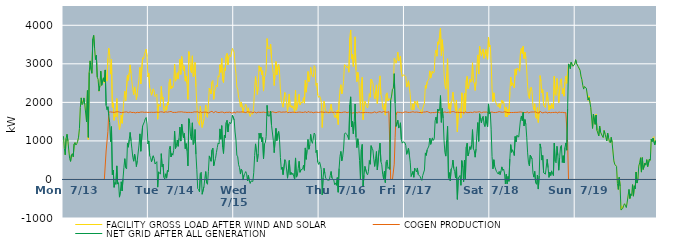
| Category | FACILITY GROSS LOAD AFTER WIND AND SOLAR | COGEN PRODUCTION | NET GRID AFTER ALL GENERATION |
|---|---|---|---|
|  Mon  7/13 | 1122 | 0 | 1122 |
|  Mon  7/13 | 817 | 0 | 808 |
|  Mon  7/13 | 640 | 0 | 640 |
|  Mon  7/13 | 1066 | 0 | 1066 |
|  Mon  7/13 | 1167 | 0 | 1172 |
|  Mon  7/13 | 1003 | 0 | 1003 |
|  Mon  7/13 | 740 | 0 | 763 |
|  Mon  7/13 | 600 | 0 | 540 |
|  Mon  7/13 | 475 | 0 | 469 |
|  Mon  7/13 | 636 | 0 | 636 |
|  Mon  7/13 | 669 | 0 | 669 |
|  Mon  7/13 | 581 | 0 | 588 |
|  Mon  7/13 | 918 | 0 | 918 |
|  Mon  7/13 | 959 | 0 | 959 |
|  Mon  7/13 | 893 | 0 | 893 |
|  Mon  7/13 | 928 | 0 | 928 |
|  Mon  7/13 | 991 | 0 | 991 |
|  Mon  7/13 | 1097 | 0 | 1097 |
|  Mon  7/13 | 1302 | 0 | 1326 |
|  Mon  7/13 | 1867 | 0 | 1867 |
|  Mon  7/13 | 2116 | 0 | 2116 |
|  Mon  7/13 | 1944 | 0 | 1944 |
|  Mon  7/13 | 1960 | 0 | 1970 |
|  Mon  7/13 | 2115 | 0 | 2115 |
|  Mon  7/13 | 1944 | 0 | 1944 |
|  Mon  7/13 | 1920 | 0 | 1920 |
|  Mon  7/13 | 1493 | 0 | 1493 |
|  Mon  7/13 | 2306 | 0 | 2306 |
|  Mon  7/13 | 1040 | 0 | 1092 |
|  Mon  7/13 | 2775 | 0 | 2776 |
|  Mon  7/13 | 3076 | 0 | 3076 |
|  Mon  7/13 | 2848 | 0 | 2848 |
|  Mon  7/13 | 2754 | 0 | 2754 |
|  Mon  7/13 | 3640 | 0 | 3650 |
|  Mon  7/13 | 3739 | 0 | 3739 |
|  Mon  7/13 | 3408 | 0 | 3408 |
|  Mon  7/13 | 3111 | 0 | 3111 |
|  Mon  7/13 | 3222 | 0 | 3221 |
|  Mon  7/13 | 2654 | 0 | 2654 |
|  Mon  7/13 | 2595 | 0 | 2595 |
|  Mon  7/13 | 2288 | 0 | 2292 |
|  Mon  7/13 | 2429 | 0 | 2434 |
|  Mon  7/13 | 2809 | 0 | 2809 |
|  Mon  7/13 | 2442 | 0 | 2442 |
|  Mon  7/13 | 2431 | 0 | 2431 |
|  Mon  7/13 | 2636 | 0 | 2636 |
|  Mon  7/13 | 2501 | 0 | 2535 |
|  Mon  7/13 | 2841 | 0 | 2841 |
|  Mon  7/13 | 2657 | 738 | 1919 |
|  Mon  7/13 | 2550 | 739 | 1811 |
|  Mon  7/13 | 3140 | 1246 | 1886 |
|  Mon  7/13 | 3405 | 1747 | 1658 |
|  Mon  7/13 | 3223 | 1749 | 1474 |
|  Mon  7/13 | 2733 | 1752 | 981 |
|  Mon  7/13 | 3113 | 1743 | 1370 |
|  Mon  7/13 | 1871 | 1745 | 126 |
|  Mon  7/13 | 1987 | 1743 | 244 |
|  Mon  7/13 | 1535 | 1739 | -204 |
|  Mon  7/13 | 1700 | 1753 | -79 |
|  Mon  7/13 | 1625 | 1751 | -126 |
|  Mon  7/13 | 2098 | 1746 | 352 |
|  Mon  7/13 | 1643 | 1758 | -120 |
|  Mon  7/13 | 1661 | 1743 | -82 |
|  Mon  7/13 | 1291 | 1746 | -459 |
|  Mon  7/13 | 1450 | 1743 | -322 |
|  Mon  7/13 | 1673 | 1733 | -60 |
|  Mon  7/13 | 1456 | 1748 | -299 |
|  Mon  7/13 | 1764 | 1741 | 23 |
|  Mon  7/13 | 2071 | 1750 | 314 |
|  Mon  7/13 | 2287 | 1748 | 539 |
|  Mon  7/13 | 2043 | 1738 | 305 |
|  Mon  7/13 | 2033 | 1753 | 273 |
|  Mon  7/13 | 2709 | 1757 | 939 |
|  Mon  7/13 | 2570 | 1733 | 837 |
|  Mon  7/13 | 2767 | 1731 | 1036 |
|  Mon  7/13 | 2973 | 1753 | 1220 |
|  Mon  7/13 | 2750 | 1748 | 1002 |
|  Mon  7/13 | 2530 | 1736 | 794 |
|  Mon  7/13 | 2340 | 1752 | 577 |
|  Mon  7/13 | 2201 | 1740 | 473 |
|  Mon  7/13 | 2402 | 1738 | 659 |
|  Mon  7/13 | 2270 | 1727 | 530 |
|  Mon  7/13 | 2074 | 1740 | 334 |
|  Mon  7/13 | 2233 | 1742 | 491 |
|  Mon  7/13 | 2228 | 1753 | 486 |
|  Mon  7/13 | 2628 | 1736 | 892 |
|  Mon  7/13 | 2906 | 1757 | 1183 |
|  Mon  7/13 | 2480 | 1748 | 732 |
|  Mon  7/13 | 2458 | 1745 | 713 |
|  Mon  7/13 | 3156 | 1749 | 1385 |
|  Mon  7/13 | 3124 | 1736 | 1388 |
|  Mon  7/13 | 3235 | 1741 | 1494 |
|  Mon  7/13 | 3312 | 1740 | 1572 |
|  Mon  7/13 | 3379 | 1745 | 1607 |
|  Mon  7/13 | 3187 | 1749 | 1438 |
|  Mon  7/13 | 2662 | 1739 | 923 |
|  Tue  7/14 | 2753 | 1753 | 1000 |
|  Tue  7/14 | 2385 | 1741 | 615 |
|  Tue  7/14 | 2312 | 1742 | 570 |
|  Tue  7/14 | 2186 | 1743 | 458 |
|  Tue  7/14 | 2177 | 1745 | 441 |
|  Tue  7/14 | 2351 | 1740 | 614 |
|  Tue  7/14 | 2295 | 1761 | 545 |
|  Tue  7/14 | 2147 | 1742 | 400 |
|  Tue  7/14 | 2150 | 1761 | 389 |
|  Tue  7/14 | 2217 | 1747 | 461 |
|  Tue  7/14 | 1562 | 1738 | -199 |
|  Tue  7/14 | 1951 | 1740 | 198 |
|  Tue  7/14 | 1932 | 1765 | 182 |
|  Tue  7/14 | 1891 | 1753 | 138 |
|  Tue  7/14 | 2415 | 1746 | 669 |
|  Tue  7/14 | 2084 | 1753 | 331 |
|  Tue  7/14 | 2134 | 1738 | 396 |
|  Tue  7/14 | 1792 | 1738 | 54 |
|  Tue  7/14 | 1747 | 1738 | 9 |
|  Tue  7/14 | 1901 | 1754 | 147 |
|  Tue  7/14 | 1797 | 1763 | 34 |
|  Tue  7/14 | 1999 | 1745 | 238 |
|  Tue  7/14 | 1933 | 1732 | 201 |
|  Tue  7/14 | 2533 | 1756 | 777 |
|  Tue  7/14 | 2608 | 1747 | 861 |
|  Tue  7/14 | 2349 | 1764 | 585 |
|  Tue  7/14 | 2423 | 1748 | 674 |
|  Tue  7/14 | 2379 | 1739 | 629 |
|  Tue  7/14 | 2499 | 1740 | 759 |
|  Tue  7/14 | 2994 | 1740 | 1254 |
|  Tue  7/14 | 2550 | 1748 | 802 |
|  Tue  7/14 | 2627 | 1740 | 879 |
|  Tue  7/14 | 2769 | 1747 | 1022 |
|  Tue  7/14 | 2605 | 1751 | 860 |
|  Tue  7/14 | 2821 | 1754 | 1067 |
|  Tue  7/14 | 3120 | 1752 | 1358 |
|  Tue  7/14 | 2725 | 1731 | 994 |
|  Tue  7/14 | 3190 | 1755 | 1435 |
|  Tue  7/14 | 3210 | 1754 | 1456 |
|  Tue  7/14 | 2824 | 1745 | 1079 |
|  Tue  7/14 | 2946 | 1752 | 1194 |
|  Tue  7/14 | 2550 | 1744 | 800 |
|  Tue  7/14 | 2683 | 1753 | 930 |
|  Tue  7/14 | 2488 | 1738 | 746 |
|  Tue  7/14 | 2077 | 1726 | 351 |
|  Tue  7/14 | 3317 | 1741 | 1576 |
|  Tue  7/14 | 3197 | 1740 | 1457 |
|  Tue  7/14 | 2827 | 1738 | 1111 |
|  Tue  7/14 | 2767 | 1745 | 1022 |
|  Tue  7/14 | 3207 | 1738 | 1469 |
|  Tue  7/14 | 2660 | 1752 | 908 |
|  Tue  7/14 | 2702 | 1753 | 963 |
|  Tue  7/14 | 3037 | 1741 | 1296 |
|  Tue  7/14 | 2405 | 1751 | 654 |
|  Tue  7/14 | 1968 | 1741 | 251 |
|  Tue  7/14 | 1529 | 1754 | -239 |
|  Tue  7/14 | 1520 | 1743 | -265 |
|  Tue  7/14 | 1405 | 1731 | -322 |
|  Tue  7/14 | 1904 | 1762 | 157 |
|  Tue  7/14 | 1923 | 1736 | 187 |
|  Tue  7/14 | 1351 | 1735 | -384 |
|  Tue  7/14 | 1327 | 1744 | -377 |
|  Tue  7/14 | 1563 | 1749 | -186 |
|  Tue  7/14 | 1767 | 1746 | 21 |
|  Tue  7/14 | 1933 | 1734 | 204 |
|  Tue  7/14 | 1656 | 1744 | -88 |
|  Tue  7/14 | 1610 | 1736 | -126 |
|  Tue  7/14 | 1933 | 1726 | 207 |
|  Tue  7/14 | 2368 | 1741 | 611 |
|  Tue  7/14 | 2379 | 1749 | 630 |
|  Tue  7/14 | 2219 | 1747 | 472 |
|  Tue  7/14 | 2530 | 1768 | 762 |
|  Tue  7/14 | 2567 | 1754 | 813 |
|  Tue  7/14 | 2078 | 1731 | 356 |
|  Tue  7/14 | 2286 | 1750 | 459 |
|  Tue  7/14 | 2310 | 1763 | 547 |
|  Tue  7/14 | 2449 | 1755 | 694 |
|  Tue  7/14 | 2403 | 1741 | 826 |
|  Tue  7/14 | 2692 | 1746 | 946 |
|  Tue  7/14 | 2655 | 1735 | 920 |
|  Tue  7/14 | 2977 | 1738 | 1312 |
|  Tue  7/14 | 2776 | 1747 | 1044 |
|  Tue  7/14 | 3141 | 1745 | 1396 |
|  Tue  7/14 | 2582 | 1749 | 833 |
|  Tue  7/14 | 2512 | 1733 | 673 |
|  Tue  7/14 | 2894 | 1729 | 1152 |
|  Tue  7/14 | 2829 | 1744 | 1085 |
|  Tue  7/14 | 3211 | 1743 | 1476 |
|  Tue  7/14 | 3270 | 1735 | 1535 |
|  Tue  7/14 | 2972 | 1741 | 1231 |
|  Tue  7/14 | 3188 | 1751 | 1437 |
|  Tue  7/14 | 3231 | 1746 | 1485 |
|  Tue  7/14 | 3182 | 1739 | 1443 |
|  Tue  7/14 | 3202 | 1726 | 1495 |
|  Tue  7/14 | 3400 | 1731 | 1669 |
|  Tue  7/14 | 3379 | 1726 | 1653 |
|  Wed  7/15 | 3300 | 1756 | 1544 |
|  Wed  7/15 | 2962 | 1722 | 1230 |
|  Wed  7/15 | 2750 | 1741 | 1023 |
|  Wed  7/15 | 2399 | 1753 | 632 |
|  Wed  7/15 | 2336 | 1757 | 589 |
|  Wed  7/15 | 2127 | 1747 | 380 |
|  Wed  7/15 | 2067 | 1748 | 312 |
|  Wed  7/15 | 1885 | 1748 | 140 |
|  Wed  7/15 | 2009 | 1743 | 266 |
|  Wed  7/15 | 1984 | 1753 | 231 |
|  Wed  7/15 | 1732 | 1747 | -15 |
|  Wed  7/15 | 1858 | 1747 | 111 |
|  Wed  7/15 | 1901 | 1745 | 157 |
|  Wed  7/15 | 1954 | 1735 | 204 |
|  Wed  7/15 | 1880 | 1732 | 148 |
|  Wed  7/15 | 1720 | 1758 | -38 |
|  Wed  7/15 | 1857 | 1753 | 104 |
|  Wed  7/15 | 1707 | 1744 | -37 |
|  Wed  7/15 | 1634 | 1738 | -104 |
|  Wed  7/15 | 1713 | 1752 | -39 |
|  Wed  7/15 | 1721 | 1736 | -26 |
|  Wed  7/15 | 1695 | 1731 | -51 |
|  Wed  7/15 | 1918 | 1744 | 174 |
|  Wed  7/15 | 2370 | 1751 | 619 |
|  Wed  7/15 | 2669 | 1748 | 923 |
|  Wed  7/15 | 2439 | 1726 | 713 |
|  Wed  7/15 | 2206 | 1730 | 461 |
|  Wed  7/15 | 2407 | 1747 | 666 |
|  Wed  7/15 | 2949 | 1749 | 1200 |
|  Wed  7/15 | 2809 | 1740 | 1069 |
|  Wed  7/15 | 2915 | 1744 | 1202 |
|  Wed  7/15 | 2716 | 1741 | 975 |
|  Wed  7/15 | 2819 | 1733 | 1086 |
|  Wed  7/15 | 2293 | 1747 | 536 |
|  Wed  7/15 | 2661 | 1738 | 923 |
|  Wed  7/15 | 2690 | 1738 | 952 |
|  Wed  7/15 | 2859 | 1747 | 1113 |
|  Wed  7/15 | 3655 | 1733 | 1922 |
|  Wed  7/15 | 3392 | 1745 | 1647 |
|  Wed  7/15 | 3381 | 1757 | 1624 |
|  Wed  7/15 | 3400 | 1752 | 1648 |
|  Wed  7/15 | 3513 | 1733 | 1771 |
|  Wed  7/15 | 3143 | 1739 | 1404 |
|  Wed  7/15 | 3163 | 1757 | 1406 |
|  Wed  7/15 | 2750 | 1741 | 1019 |
|  Wed  7/15 | 2438 | 1743 | 695 |
|  Wed  7/15 | 2451 | 1749 | 699 |
|  Wed  7/15 | 3057 | 1732 | 1325 |
|  Wed  7/15 | 2712 | 1733 | 1007 |
|  Wed  7/15 | 2922 | 1749 | 1186 |
|  Wed  7/15 | 2982 | 1736 | 1246 |
|  Wed  7/15 | 2784 | 1756 | 1034 |
|  Wed  7/15 | 2323 | 1751 | 572 |
|  Wed  7/15 | 2053 | 1742 | 263 |
|  Wed  7/15 | 2055 | 1736 | 319 |
|  Wed  7/15 | 1875 | 1750 | 125 |
|  Wed  7/15 | 1895 | 1744 | 133 |
|  Wed  7/15 | 2257 | 1747 | 513 |
|  Wed  7/15 | 2205 | 1743 | 462 |
|  Wed  7/15 | 2229 | 1757 | 472 |
|  Wed  7/15 | 1763 | 1731 | 32 |
|  Wed  7/15 | 1766 | 1737 | 21 |
|  Wed  7/15 | 2217 | 1741 | 493 |
|  Wed  7/15 | 1879 | 1752 | 127 |
|  Wed  7/15 | 1924 | 1738 | 186 |
|  Wed  7/15 | 1851 | 1730 | 121 |
|  Wed  7/15 | 1910 | 1746 | 164 |
|  Wed  7/15 | 1825 | 1751 | 74 |
|  Wed  7/15 | 1735 | 1741 | 6 |
|  Wed  7/15 | 2311 | 1753 | 558 |
|  Wed  7/15 | 1797 | 1738 | 59 |
|  Wed  7/15 | 1815 | 1743 | 93 |
|  Wed  7/15 | 2031 | 1745 | 286 |
|  Wed  7/15 | 2207 | 1737 | 470 |
|  Wed  7/15 | 1935 | 1749 | 186 |
|  Wed  7/15 | 1993 | 1745 | 248 |
|  Wed  7/15 | 1981 | 1740 | 241 |
|  Wed  7/15 | 1998 | 1727 | 271 |
|  Wed  7/15 | 2122 | 1740 | 372 |
|  Wed  7/15 | 1980 | 1743 | 237 |
|  Wed  7/15 | 2573 | 1755 | 818 |
|  Wed  7/15 | 2264 | 1743 | 521 |
|  Wed  7/15 | 2504 | 1731 | 773 |
|  Wed  7/15 | 2801 | 1763 | 1038 |
|  Wed  7/15 | 2536 | 1752 | 784 |
|  Wed  7/15 | 2632 | 1743 | 889 |
|  Wed  7/15 | 2905 | 1735 | 1170 |
|  Wed  7/15 | 2737 | 1747 | 990 |
|  Wed  7/15 | 2683 | 1754 | 937 |
|  Wed  7/15 | 2655 | 1730 | 925 |
|  Wed  7/15 | 2952 | 1748 | 1204 |
|  Wed  7/15 | 2905 | 1744 | 1161 |
|  Wed  7/15 | 2441 | 1749 | 700 |
|  Wed  7/15 | 2502 | 1745 | 757 |
|  Wed  7/15 | 2191 | 1735 | 450 |
|  Wed  7/15 | 2128 | 1738 | 390 |
|  Thu  7/16 | 2167 | 1736 | 455 |
|  Thu  7/16 | 2120 | 1749 | 373 |
|  Thu  7/16 | 1998 | 1744 | 254 |
|  Thu  7/16 | 1349 | 1750 | -401 |
|  Thu  7/16 | 1765 | 1746 | 44 |
|  Thu  7/16 | 2031 | 1740 | 291 |
|  Thu  7/16 | 1888 | 1734 | 154 |
|  Thu  7/16 | 1772 | 1746 | 26 |
|  Thu  7/16 | 1781 | 1738 | 43 |
|  Thu  7/16 | 1728 | 1743 | -15 |
|  Thu  7/16 | 1722 | 1748 | -26 |
|  Thu  7/16 | 1723 | 1737 | -18 |
|  Thu  7/16 | 1824 | 1727 | 100 |
|  Thu  7/16 | 1952 | 1746 | 206 |
|  Thu  7/16 | 1785 | 1744 | 34 |
|  Thu  7/16 | 1798 | 1737 | 59 |
|  Thu  7/16 | 1726 | 1739 | -13 |
|  Thu  7/16 | 1611 | 1746 | -135 |
|  Thu  7/16 | 1661 | 1751 | -90 |
|  Thu  7/16 | 1588 | 1736 | -152 |
|  Thu  7/16 | 1799 | 1740 | 49 |
|  Thu  7/16 | 1425 | 1744 | -332 |
|  Thu  7/16 | 2026 | 1737 | 284 |
|  Thu  7/16 | 2329 | 1736 | 599 |
|  Thu  7/16 | 2458 | 1731 | 727 |
|  Thu  7/16 | 2218 | 1735 | 483 |
|  Thu  7/16 | 2323 | 1726 | 597 |
|  Thu  7/16 | 2535 | 1747 | 788 |
|  Thu  7/16 | 2977 | 1756 | 1176 |
|  Thu  7/16 | 2959 | 1751 | 1208 |
|  Thu  7/16 | 2945 | 1739 | 1206 |
|  Thu  7/16 | 2894 | 1732 | 1162 |
|  Thu  7/16 | 2931 | 1749 | 1182 |
|  Thu  7/16 | 2782 | 1747 | 1036 |
|  Thu  7/16 | 3678 | 1742 | 1936 |
|  Thu  7/16 | 3878 | 1734 | 2144 |
|  Thu  7/16 | 3124 | 1759 | 1365 |
|  Thu  7/16 | 3251 | 1724 | 1504 |
|  Thu  7/16 | 2932 | 1746 | 1186 |
|  Thu  7/16 | 3229 | 1734 | 1495 |
|  Thu  7/16 | 3701 | 1745 | 1956 |
|  Thu  7/16 | 2839 | 1738 | 1101 |
|  Thu  7/16 | 2536 | 1732 | 825 |
|  Thu  7/16 | 2782 | 1726 | 1056 |
|  Thu  7/16 | 2641 | 1753 | 888 |
|  Thu  7/16 | 2240 | 1748 | 492 |
|  Thu  7/16 | 1798 | 1734 | 1 |
|  Thu  7/16 | 2497 | 1746 | 778 |
|  Thu  7/16 | 2650 | 1733 | 910 |
|  Thu  7/16 | 1552 | 1733 | -181 |
|  Thu  7/16 | 1842 | 1734 | 108 |
|  Thu  7/16 | 2027 | 1727 | 340 |
|  Thu  7/16 | 1969 | 1741 | 316 |
|  Thu  7/16 | 1899 | 1730 | 159 |
|  Thu  7/16 | 1853 | 1736 | 120 |
|  Thu  7/16 | 1969 | 1729 | 205 |
|  Thu  7/16 | 2224 | 1734 | 490 |
|  Thu  7/16 | 2134 | 1739 | 395 |
|  Thu  7/16 | 2603 | 1727 | 876 |
|  Thu  7/16 | 2552 | 1742 | 810 |
|  Thu  7/16 | 2499 | 1735 | 764 |
|  Thu  7/16 | 2273 | 1748 | 525 |
|  Thu  7/16 | 2088 | 1754 | 338 |
|  Thu  7/16 | 2265 | 1757 | 539 |
|  Thu  7/16 | 2453 | 1729 | 724 |
|  Thu  7/16 | 1969 | 1750 | 246 |
|  Thu  7/16 | 1980 | 1748 | 225 |
|  Thu  7/16 | 2497 | 1741 | 759 |
|  Thu  7/16 | 2688 | 1759 | 942 |
|  Thu  7/16 | 2200 | 1738 | 462 |
|  Thu  7/16 | 2118 | 1738 | 380 |
|  Thu  7/16 | 1868 | 1732 | 136 |
|  Thu  7/16 | 1810 | 1764 | 14 |
|  Thu  7/16 | 1962 | 1747 | 215 |
|  Thu  7/16 | 1669 | 1746 | -81 |
|  Thu  7/16 | 2208 | 1755 | 459 |
|  Thu  7/16 | 2248 | 1742 | 506 |
|  Thu  7/16 | 2038 | 1758 | 285 |
|  Thu  7/16 | 2094 | 1759 | 314 |
|  Thu  7/16 | 2093 | 1736 | 260 |
|  Thu  7/16 | 2053 | 0 | 2053 |
|  Thu  7/16 | 2129 | 0 | 2163 |
|  Thu  7/16 | 2339 | 0 | 2339 |
|  Thu  7/16 | 2368 | 0 | 2368 |
|  Thu  7/16 | 3141 | 397 | 2744 |
|  Thu  7/16 | 3069 | 1087 | 1982 |
|  Thu  7/16 | 3013 | 1655 | 1375 |
|  Thu  7/16 | 3102 | 1745 | 1366 |
|  Thu  7/16 | 3302 | 1743 | 1534 |
|  Thu  7/16 | 3075 | 1742 | 1333 |
|  Thu  7/16 | 3110 | 1747 | 1363 |
|  Thu  7/16 | 3203 | 1739 | 1470 |
|  Thu  7/16 | 2787 | 1750 | 1037 |
|  Thu  7/16 | 2668 | 1726 | 942 |
|  Thu  7/16 | 2713 | 1737 | 975 |
|  Thu  7/16 | 2709 | 1747 | 962 |
|  Fri  7/17 | 2696 | 1741 | 955 |
|  Fri  7/17 | 2668 | 1753 | 881 |
|  Fri  7/17 | 2396 | 1748 | 653 |
|  Fri  7/17 | 2478 | 1741 | 737 |
|  Fri  7/17 | 2561 | 1746 | 815 |
|  Fri  7/17 | 2389 | 1739 | 638 |
|  Fri  7/17 | 2203 | 1754 | 449 |
|  Fri  7/17 | 1826 | 1745 | 77 |
|  Fri  7/17 | 1798 | 1731 | 74 |
|  Fri  7/17 | 1965 | 1757 | 206 |
|  Fri  7/17 | 1809 | 1752 | 57 |
|  Fri  7/17 | 2036 | 1743 | 293 |
|  Fri  7/17 | 2047 | 1739 | 256 |
|  Fri  7/17 | 1942 | 1749 | 193 |
|  Fri  7/17 | 2039 | 1740 | 298 |
|  Fri  7/17 | 1868 | 1742 | 128 |
|  Fri  7/17 | 1869 | 1718 | 139 |
|  Fri  7/17 | 1815 | 1735 | 80 |
|  Fri  7/17 | 1750 | 1733 | 17 |
|  Fri  7/17 | 1706 | 1739 | -24 |
|  Fri  7/17 | 1842 | 1742 | 100 |
|  Fri  7/17 | 1822 | 1747 | 75 |
|  Fri  7/17 | 1981 | 1735 | 246 |
|  Fri  7/17 | 2440 | 1751 | 689 |
|  Fri  7/17 | 2366 | 1742 | 624 |
|  Fri  7/17 | 2530 | 1762 | 768 |
|  Fri  7/17 | 2555 | 1752 | 793 |
|  Fri  7/17 | 2609 | 1741 | 868 |
|  Fri  7/17 | 2817 | 1745 | 1072 |
|  Fri  7/17 | 2629 | 1728 | 911 |
|  Fri  7/17 | 2634 | 1744 | 890 |
|  Fri  7/17 | 2814 | 1736 | 1078 |
|  Fri  7/17 | 2758 | 1744 | 1014 |
|  Fri  7/17 | 2791 | 1734 | 1057 |
|  Fri  7/17 | 3263 | 1742 | 1521 |
|  Fri  7/17 | 3355 | 1745 | 1617 |
|  Fri  7/17 | 3198 | 1741 | 1457 |
|  Fri  7/17 | 3569 | 1744 | 1825 |
|  Fri  7/17 | 3505 | 1733 | 1772 |
|  Fri  7/17 | 3527 | 1729 | 1798 |
|  Fri  7/17 | 3924 | 1749 | 2175 |
|  Fri  7/17 | 3210 | 1728 | 1482 |
|  Fri  7/17 | 3626 | 1740 | 1842 |
|  Fri  7/17 | 3333 | 1740 | 1593 |
|  Fri  7/17 | 2762 | 1747 | 1015 |
|  Fri  7/17 | 2449 | 1751 | 698 |
|  Fri  7/17 | 2343 | 1738 | 605 |
|  Fri  7/17 | 2748 | 1736 | 1012 |
|  Fri  7/17 | 3132 | 1753 | 1379 |
|  Fri  7/17 | 1835 | 1744 | 31 |
|  Fri  7/17 | 1972 | 1736 | 176 |
|  Fri  7/17 | 1712 | 1744 | -32 |
|  Fri  7/17 | 2006 | 1735 | 271 |
|  Fri  7/17 | 2061 | 1757 | 317 |
|  Fri  7/17 | 2264 | 1743 | 502 |
|  Fri  7/17 | 2018 | 1758 | 279 |
|  Fri  7/17 | 1940 | 1738 | 202 |
|  Fri  7/17 | 1781 | 1741 | 40 |
|  Fri  7/17 | 2058 | 1732 | 326 |
|  Fri  7/17 | 1231 | 1743 | -516 |
|  Fri  7/17 | 1769 | 1750 | 33 |
|  Fri  7/17 | 1757 | 1737 | 20 |
|  Fri  7/17 | 1848 | 1749 | 103 |
|  Fri  7/17 | 1591 | 1743 | -152 |
|  Fri  7/17 | 2247 | 1758 | 489 |
|  Fri  7/17 | 2070 | 1738 | 325 |
|  Fri  7/17 | 1689 | 1749 | -60 |
|  Fri  7/17 | 2228 | 1726 | 502 |
|  Fri  7/17 | 1757 | 1755 | 12 |
|  Fri  7/17 | 2572 | 1744 | 841 |
|  Fri  7/17 | 2676 | 1734 | 942 |
|  Fri  7/17 | 2354 | 1742 | 612 |
|  Fri  7/17 | 2433 | 1737 | 696 |
|  Fri  7/17 | 2602 | 1752 | 850 |
|  Fri  7/17 | 2523 | 1743 | 780 |
|  Fri  7/17 | 2622 | 1759 | 903 |
|  Fri  7/17 | 3027 | 1735 | 1292 |
|  Fri  7/17 | 2535 | 1740 | 795 |
|  Fri  7/17 | 2501 | 1754 | 747 |
|  Fri  7/17 | 2309 | 1731 | 578 |
|  Fri  7/17 | 2538 | 1744 | 794 |
|  Fri  7/17 | 2969 | 1747 | 1202 |
|  Fri  7/17 | 3230 | 1749 | 1476 |
|  Fri  7/17 | 2738 | 1751 | 987 |
|  Fri  7/17 | 3462 | 1758 | 1704 |
|  Fri  7/17 | 3286 | 1733 | 1553 |
|  Fri  7/17 | 3200 | 1732 | 1468 |
|  Fri  7/17 | 3324 | 1729 | 1595 |
|  Fri  7/17 | 3387 | 1747 | 1640 |
|  Fri  7/17 | 3143 | 1732 | 1435 |
|  Fri  7/17 | 3120 | 1747 | 1373 |
|  Fri  7/17 | 3370 | 1736 | 1634 |
|  Fri  7/17 | 3199 | 1748 | 1451 |
|  Fri  7/17 | 3117 | 1742 | 1368 |
|  Fri  7/17 | 3693 | 1720 | 1960 |
|  Fri  7/17 | 3441 | 1745 | 1707 |
|  Sat  7/18 | 3482 | 1742 | 1740 |
|  Sat  7/18 | 3035 | 1740 | 1304 |
|  Sat  7/18 | 2342 | 1749 | 593 |
|  Sat  7/18 | 2018 | 1746 | 275 |
|  Sat  7/18 | 2248 | 1736 | 512 |
|  Sat  7/18 | 2081 | 1746 | 335 |
|  Sat  7/18 | 2059 | 1736 | 336 |
|  Sat  7/18 | 1954 | 1749 | 205 |
|  Sat  7/18 | 1917 | 1744 | 173 |
|  Sat  7/18 | 1883 | 1744 | 139 |
|  Sat  7/18 | 1970 | 1760 | 210 |
|  Sat  7/18 | 1848 | 1745 | 124 |
|  Sat  7/18 | 1961 | 1747 | 214 |
|  Sat  7/18 | 2057 | 1745 | 326 |
|  Sat  7/18 | 1976 | 1742 | 237 |
|  Sat  7/18 | 2023 | 1753 | 270 |
|  Sat  7/18 | 1882 | 1756 | 169 |
|  Sat  7/18 | 1629 | 1746 | -117 |
|  Sat  7/18 | 1881 | 1747 | 134 |
|  Sat  7/18 | 1623 | 1737 | -114 |
|  Sat  7/18 | 1819 | 1731 | 78 |
|  Sat  7/18 | 1671 | 1720 | -49 |
|  Sat  7/18 | 2270 | 1737 | 529 |
|  Sat  7/18 | 2658 | 1754 | 904 |
|  Sat  7/18 | 2430 | 1737 | 704 |
|  Sat  7/18 | 2507 | 1737 | 770 |
|  Sat  7/18 | 2455 | 1737 | 718 |
|  Sat  7/18 | 2376 | 1755 | 621 |
|  Sat  7/18 | 2856 | 1741 | 1115 |
|  Sat  7/18 | 2706 | 1733 | 973 |
|  Sat  7/18 | 2884 | 1740 | 1143 |
|  Sat  7/18 | 2883 | 1748 | 1135 |
|  Sat  7/18 | 2857 | 1745 | 1101 |
|  Sat  7/18 | 2807 | 1731 | 1076 |
|  Sat  7/18 | 3306 | 1751 | 1555 |
|  Sat  7/18 | 3403 | 1756 | 1647 |
|  Sat  7/18 | 3267 | 1742 | 1525 |
|  Sat  7/18 | 3454 | 1748 | 1741 |
|  Sat  7/18 | 3135 | 1737 | 1389 |
|  Sat  7/18 | 3299 | 1745 | 1554 |
|  Sat  7/18 | 3163 | 1737 | 1426 |
|  Sat  7/18 | 2837 | 1752 | 1097 |
|  Sat  7/18 | 2413 | 1756 | 689 |
|  Sat  7/18 | 2154 | 1723 | 431 |
|  Sat  7/18 | 2101 | 1748 | 353 |
|  Sat  7/18 | 2362 | 1745 | 632 |
|  Sat  7/18 | 2396 | 1747 | 648 |
|  Sat  7/18 | 2281 | 1750 | 531 |
|  Sat  7/18 | 1914 | 1745 | 169 |
|  Sat  7/18 | 1811 | 1750 | 61 |
|  Sat  7/18 | 1963 | 1755 | 208 |
|  Sat  7/18 | 1626 | 1753 | -82 |
|  Sat  7/18 | 1579 | 1755 | -126 |
|  Sat  7/18 | 1863 | 1730 | 115 |
|  Sat  7/18 | 1478 | 1727 | -249 |
|  Sat  7/18 | 1784 | 1726 | 90 |
|  Sat  7/18 | 2694 | 1771 | 923 |
|  Sat  7/18 | 2550 | 1745 | 805 |
|  Sat  7/18 | 2246 | 1743 | 503 |
|  Sat  7/18 | 2332 | 1727 | 621 |
|  Sat  7/18 | 1919 | 1744 | 175 |
|  Sat  7/18 | 1939 | 1741 | 198 |
|  Sat  7/18 | 1867 | 1730 | 137 |
|  Sat  7/18 | 1870 | 1750 | 131 |
|  Sat  7/18 | 2264 | 1721 | 524 |
|  Sat  7/18 | 2044 | 1738 | 306 |
|  Sat  7/18 | 1795 | 1741 | 54 |
|  Sat  7/18 | 1919 | 1732 | 187 |
|  Sat  7/18 | 1834 | 1731 | 103 |
|  Sat  7/18 | 1971 | 1748 | 223 |
|  Sat  7/18 | 1980 | 1738 | 239 |
|  Sat  7/18 | 1837 | 1737 | 100 |
|  Sat  7/18 | 2681 | 1738 | 943 |
|  Sat  7/18 | 2208 | 1737 | 471 |
|  Sat  7/18 | 2177 | 1745 | 432 |
|  Sat  7/18 | 2621 | 1748 | 860 |
|  Sat  7/18 | 2341 | 1720 | 621 |
|  Sat  7/18 | 1991 | 1751 | 240 |
|  Sat  7/18 | 2333 | 1768 | 567 |
|  Sat  7/18 | 2580 | 1738 | 842 |
|  Sat  7/18 | 2614 | 1731 | 883 |
|  Sat  7/18 | 2217 | 1741 | 441 |
|  Sat  7/18 | 2359 | 1742 | 617 |
|  Sat  7/18 | 2161 | 1732 | 429 |
|  Sat  7/18 | 2529 | 1750 | 829 |
|  Sat  7/18 | 2681 | 1734 | 947 |
|  Sat  7/18 | 2491 | 1746 | 759 |
|  Sat  7/18 | 2791 | 951 | 1840 |
|  Sat  7/18 | 2997 | 0 | 2997 |
|  Sat  7/18 | 2935 | 0 | 2950 |
|  Sat  7/18 | 2868 | 0 | 2872 |
|  Sat  7/18 | 3047 | 0 | 3047 |
|  Sat  7/18 | 3047 | 0 | 3047 |
|  Sat  7/18 | 2937 | 0 | 2937 |
|  Sat  7/18 | 2945 | 0 | 2931 |
|  Sat  7/18 | 2998 | 0 | 2991 |
|  Sun  7/19 | 3105 | 0 | 3105 |
|  Sun  7/19 | 3010 | 0 | 3010 |
|  Sun  7/19 | 2991 | 0 | 2991 |
|  Sun  7/19 | 2923 | 0 | 2923 |
|  Sun  7/19 | 2910 | 0 | 2910 |
|  Sun  7/19 | 2826 | 0 | 2833 |
|  Sun  7/19 | 2671 | 0 | 2681 |
|  Sun  7/19 | 2593 | 0 | 2593 |
|  Sun  7/19 | 2444 | 0 | 2444 |
|  Sun  7/19 | 2345 | 0 | 2344 |
|  Sun  7/19 | 2412 | 0 | 2410 |
|  Sun  7/19 | 2432 | 0 | 2432 |
|  Sun  7/19 | 2367 | 0 | 2369 |
|  Sun  7/19 | 2387 | 0 | 2389 |
|  Sun  7/19 | 2050 | 0 | 2059 |
|  Sun  7/19 | 2166 | 0 | 2123 |
|  Sun  7/19 | 2010 | 0 | 2010 |
|  Sun  7/19 | 1871 | 0 | 1871 |
|  Sun  7/19 | 1873 | 0 | 1882 |
|  Sun  7/19 | 1325 | 0 | 1325 |
|  Sun  7/19 | 1693 | 0 | 1693 |
|  Sun  7/19 | 1679 | 0 | 1679 |
|  Sun  7/19 | 1432 | 0 | 1430 |
|  Sun  7/19 | 1695 | 0 | 1671 |
|  Sun  7/19 | 1273 | 0 | 1273 |
|  Sun  7/19 | 1267 | 0 | 1264 |
|  Sun  7/19 | 1130 | 0 | 1128 |
|  Sun  7/19 | 1385 | 0 | 1384 |
|  Sun  7/19 | 1226 | 0 | 1227 |
|  Sun  7/19 | 1246 | 0 | 1246 |
|  Sun  7/19 | 1127 | 0 | 1127 |
|  Sun  7/19 | 1087 | 0 | 1087 |
|  Sun  7/19 | 1274 | 0 | 1269 |
|  Sun  7/19 | 1188 | 0 | 1188 |
|  Sun  7/19 | 1087 | 0 | 1094 |
|  Sun  7/19 | 1004 | 0 | 1001 |
|  Sun  7/19 | 1201 | 0 | 1201 |
|  Sun  7/19 | 1085 | 0 | 1085 |
|  Sun  7/19 | 978 | 0 | 978 |
|  Sun  7/19 | 951 | 0 | 951 |
|  Sun  7/19 | 1093 | 0 | 1093 |
|  Sun  7/19 | 957 | 0 | 957 |
|  Sun  7/19 | 971 | 0 | 971 |
|  Sun  7/19 | 483 | 0 | 481 |
|  Sun  7/19 | 402 | 0 | 393 |
|  Sun  7/19 | 397 | 0 | 391 |
|  Sun  7/19 | 335 | 0 | 338 |
|  Sun  7/19 | -108 | 0 | -108 |
|  Sun  7/19 | -259 | 0 | -259 |
|  Sun  7/19 | 55 | 0 | 55 |
|  Sun  7/19 | -160 | 0 | -178 |
|  Sun  7/19 | -794 | 0 | -794 |
|  Sun  7/19 | -685 | 0 | -805 |
|  Sun  7/19 | -751 | 0 | -751 |
|  Sun  7/19 | -673 | 0 | -673 |
|  Sun  7/19 | -630 | 0 | -630 |
|  Sun  7/19 | -648 | 0 | -648 |
|  Sun  7/19 | -725 | 0 | -729 |
|  Sun  7/19 | -593 | 0 | -586 |
|  Sun  7/19 | -577 | 0 | -577 |
|  Sun  7/19 | -270 | 0 | -259 |
|  Sun  7/19 | -494 | 0 | -494 |
|  Sun  7/19 | -384 | 0 | -373 |
|  Sun  7/19 | -418 | 0 | -418 |
|  Sun  7/19 | -135 | 0 | -135 |
|  Sun  7/19 | -432 | 0 | -433 |
|  Sun  7/19 | -167 | 0 | -165 |
|  Sun  7/19 | -239 | 0 | -243 |
|  Sun  7/19 | 197 | 0 | 193 |
|  Sun  7/19 | -94 | 0 | -94 |
|  Sun  7/19 | 2 | 0 | 2 |
|  Sun  7/19 | 346 | 0 | 346 |
|  Sun  7/19 | 430 | 0 | 430 |
|  Sun  7/19 | 563 | 0 | 563 |
|  Sun  7/19 | 191 | 0 | 191 |
|  Sun  7/19 | 566 | 0 | 566 |
|  Sun  7/19 | 261 | 0 | 261 |
|  Sun  7/19 | 281 | 0 | 281 |
|  Sun  7/19 | 427 | 0 | 427 |
|  Sun  7/19 | 368 | 0 | 368 |
|  Sun  7/19 | 513 | 0 | 514 |
|  Sun  7/19 | 332 | 0 | 332 |
|  Sun  7/19 | 326 | 0 | 324 |
|  Sun  7/19 | 530 | 0 | 530 |
|  Sun  7/19 | 497 | 0 | 497 |
|  Sun  7/19 | 1047 | 0 | 1047 |
|  Sun  7/19 | 978 | 0 | 978 |
|  Sun  7/19 | 1081 | 0 | 1074 |
|  Sun  7/19 | 1111 | 0 | 1088 |
|  Sun  7/19 | 905 | 0 | 899 |
|  Sun  7/19 | 999 | 0 | 999 |
|  Sun  7/19 | 1040 | 0 | 1040 |